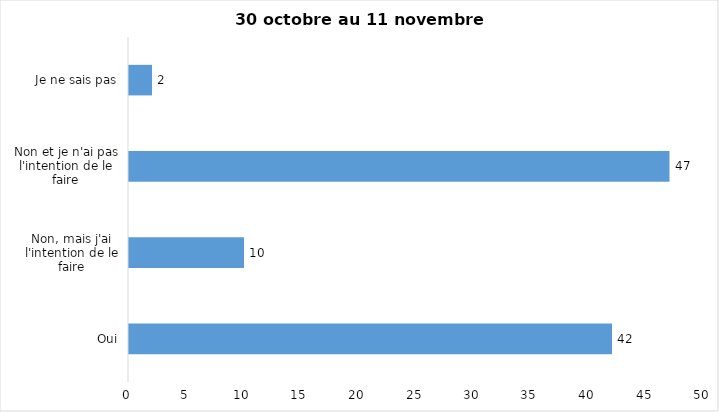
| Category | Series 0 |
|---|---|
| Oui | 42 |
| Non, mais j'ai l'intention de le faire | 10 |
| Non et je n'ai pas l'intention de le faire | 47 |
| Je ne sais pas | 2 |